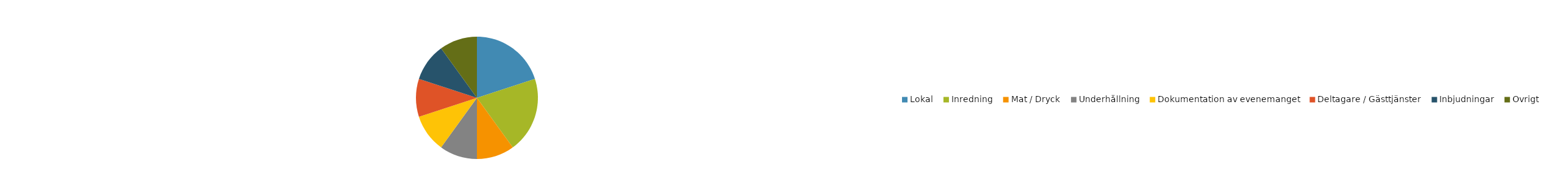
| Category | % AV BUDGET | DELSUMMOR |
|---|---|---|
| Lokal | 0.2 | 100 |
| Inredning | 0.2 | 100 |
| Mat / Dryck | 0.1 | 50 |
| Underhållning | 0.1 | 50 |
| Dokumentation av evenemanget | 0.1 | 50 |
| Deltagare / Gästtjänster | 0.1 | 50 |
| Inbjudningar | 0.1 | 50 |
| Övrigt | 0.1 | 50 |